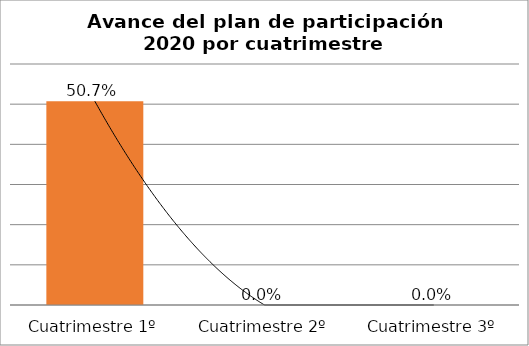
| Category | Avnace por perioros |
|---|---|
| Cuatrimestre 1º | 0.507 |
| Cuatrimestre 2º | 0 |
| Cuatrimestre 3º | 0 |